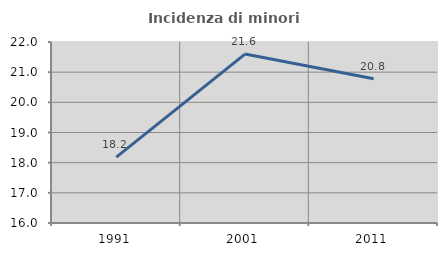
| Category | Incidenza di minori stranieri |
|---|---|
| 1991.0 | 18.182 |
| 2001.0 | 21.6 |
| 2011.0 | 20.784 |